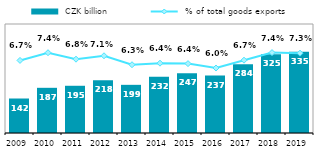
| Category |  CZK billion |
|---|---|
| 2009.0 | 142.412 |
| 2010.0 | 186.551 |
| 2011.0 | 194.971 |
| 2012.0 | 217.71 |
| 2013.0 | 198.836 |
| 2014.0 | 232.424 |
| 2015.0 | 247.168 |
| 2016.0 | 236.892 |
| 2017.0 | 283.506 |
| 2018.0 | 324.867 |
| 2019.0 | 335.466 |